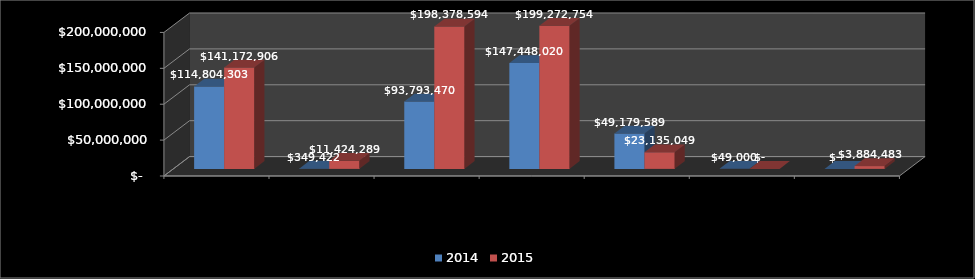
| Category | 2014 | 2015 |
|---|---|---|
| ADJUDICACION DIRECTA  | 114804303 | 141172906 |
| INVITACION A TRES PERSONAS  | 349422 | 11424289 |
| LICITACION PUBLICA INTERNACIONAL  | 93793470 | 198378594 |
| LICITACION PUBLICA NACIONAL  | 147448020 | 199272754 |
| EXCEPCIÓN DE LICITACIÓN | 49179589 | 23135049 |
| CONTRATO MARCO | 49000 | 0 |
| EXCEPCION A UNA INVITACION A CUANDO MENOS TRES PERSONAS  | 0 | 3884483 |